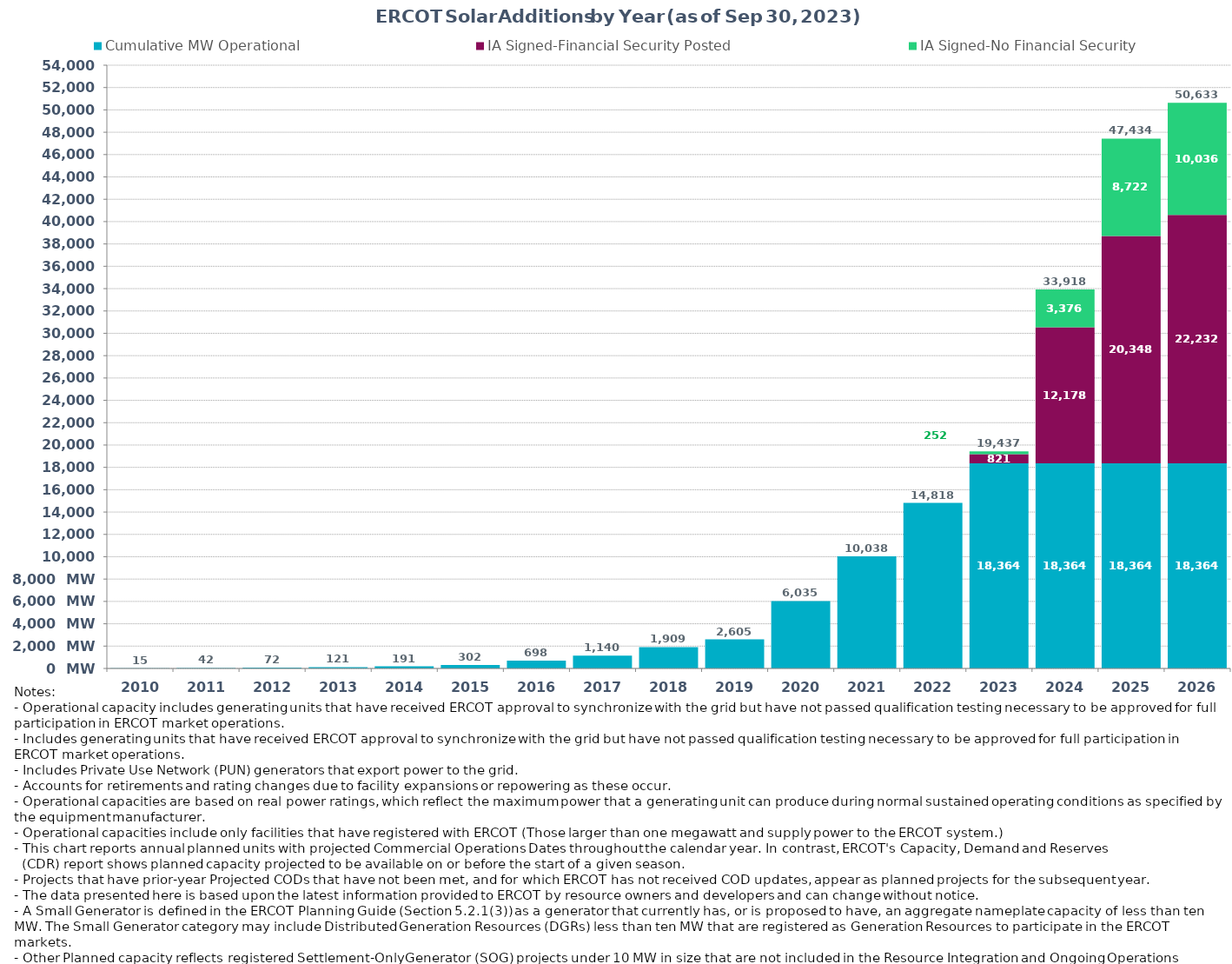
| Category | Cumulative MW Operational | IA Signed-Financial Security Posted  | IA Signed-No Financial Security  | Other Planned | Cumulative Installed and Planned |
|---|---|---|---|---|---|
| 2010.0 | 14.9 | 0 | 0 | 0 | 14.9 |
| 2011.0 | 41.6 | 0 | 0 | 0 | 41.6 |
| 2012.0 | 72 | 0 | 0 | 0 | 72 |
| 2013.0 | 121.18 | 0 | 0 | 0 | 121.18 |
| 2014.0 | 190.7 | 0 | 0 | 0 | 190.7 |
| 2015.0 | 301.71 | 0 | 0 | 0 | 301.71 |
| 2016.0 | 698.22 | 0 | 0 | 0 | 698.22 |
| 2017.0 | 1140.12 | 0 | 0 | 0 | 1140.12 |
| 2018.0 | 1909.16 | 0 | 0 | 0 | 1909.16 |
| 2019.0 | 2605.35 | 0 | 0 | 0 | 2605.35 |
| 2020.0 | 6034.64 | 0 | 0 | 0 | 6034.64 |
| 2021.0 | 10038.12 | 0 | 0 | 0 | 10038.12 |
| 2022.0 | 14818.22 | 0 | 0 | 0 | 14818.22 |
| 2023.0 | 18364.31 | 820.76 | 252 | 0 | 19437.07 |
| 2024.0 | 18364.31 | 12177.58 | 3376.21 | 0 | 33918.1 |
| 2025.0 | 18364.31 | 20347.53 | 8722.16 | 0 | 47434 |
| 2026.0 | 18364.31 | 22232.02 | 10036.3 | 0 | 50632.63 |